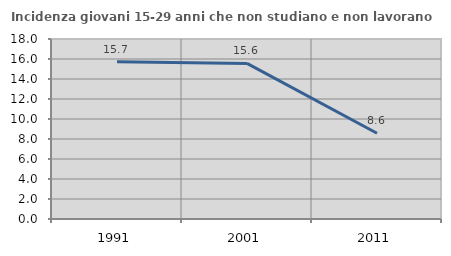
| Category | Incidenza giovani 15-29 anni che non studiano e non lavorano  |
|---|---|
| 1991.0 | 15.724 |
| 2001.0 | 15.556 |
| 2011.0 | 8.571 |